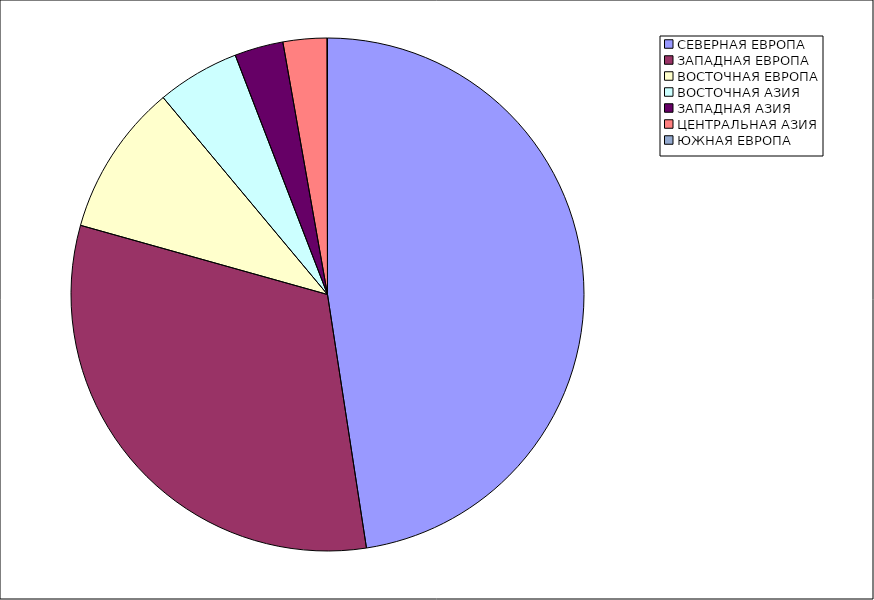
| Category | Оборот |
|---|---|
| СЕВЕРНАЯ ЕВРОПА | 47.572 |
| ЗАПАДНАЯ ЕВРОПА | 31.774 |
| ВОСТОЧНАЯ ЕВРОПА | 9.585 |
| ВОСТОЧНАЯ АЗИЯ | 5.212 |
| ЗАПАДНАЯ АЗИЯ | 3.069 |
| ЦЕНТРАЛЬНАЯ АЗИЯ | 2.762 |
| ЮЖНАЯ ЕВРОПА | 0.026 |